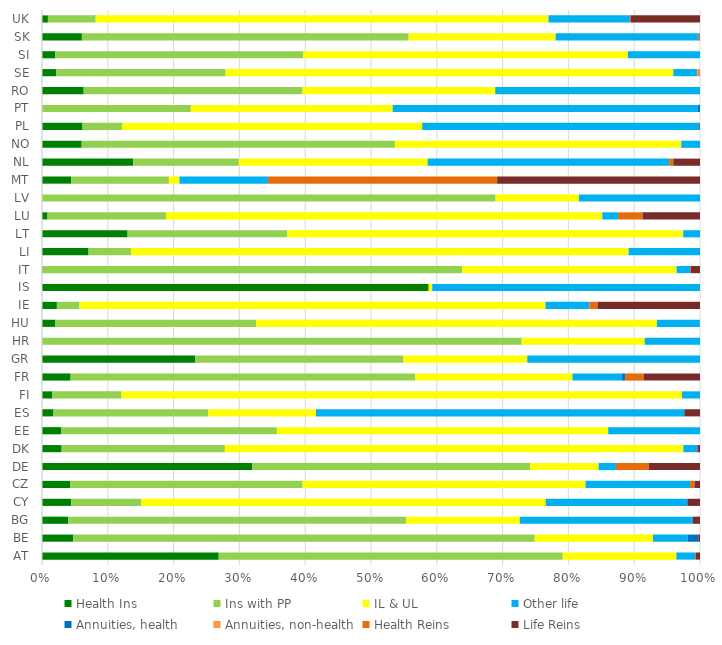
| Category | Health Ins | Ins with PP | IL & UL | Other life | Annuities, health | Annuities, non-health | Health Reins | Life Reins |
|---|---|---|---|---|---|---|---|---|
| AT | 2128.78 | 4143.22 | 1368.86 | 224.72 | 0 | 0 | 10.16 | 49.5 |
| BE | 712.99 | 10519.26 | 2694.96 | 790.87 | 242.16 | 0 | 0 | 38.92 |
| BG | 6.69 | 86 | 28.84 | 44.01 | 0 | 0 | 0 | 1.85 |
| CY | 15.49 | 37.23 | 214.92 | 75.22 | 0 | 0 | 0 | 6.74 |
| CZ | 86.45 | 708.93 | 863.95 | 319.25 | 0 | 0 | 13.66 | 16.59 |
| DE | 45901.28 | 60680.9 | 14973.67 | 3771.3 | -0.25 | 0 | 7200 | 11170.45 |
| DK | 708 | 5885.74 | 16529.8 | 470.09 | 42.69 | 0 | 3.2 | 84.96 |
| EE | 5.85 | 66.46 | 102 | 28.24 | 0 | 0 | 0 | 0 |
| ES | 546.66 | 7418.94 | 5153.27 | 17636.27 | 0 | 0 | 0 | 750.92 |
| FI | 71.4 | 476 | 3861.6 | 122.51 | 0 | 0 | 0 | 1.21 |
| FR | 7390.27 | 89070.1 | 40579.36 | 12836.24 | 744.42 | 27.43 | 4843.16 | 14503.09 |
| GR | 429.3 | 584.27 | 347.49 | 484.28 | 0 | 0 | 0 | 0.1 |
| HR | 0.24 | 288.8 | 74.14 | 33.29 | 0 | 0 | 0 | 0 |
| HU | 29.15 | 451.21 | 898.31 | 96.3 | 0 | 0 | 0.33 | 0 |
| IE | 1088.44 | 1653.97 | 34072.13 | 3211.79 | 0 | 0 | 609.81 | 7476.54 |
| IS | 27.35 | 0 | 0.25 | 18.94 | 0 | 0 | 0 | 0 |
| IT | 102.05 | 63932.1 | 32688.81 | 2062.26 | 0 | 0.97 | 130.83 | 1369.94 |
| LI | 154.94 | 141.3 | 1657.29 | 237.79 | 0 | 0 | 0 | 0 |
| LT | 20.42 | 38.09 | 94.44 | 4.01 | 0 | 0 | 0 | 0 |
| LU | 223.4 | 4766.47 | 17547.66 | 634.4 | 0 | 0 | 985.46 | 2307.51 |
| LV | 0 | 29.33 | 5.39 | 7.83 | 0 | 0 | 0 | 0 |
| MT | 97.37 | 324.69 | 35.11 | 294.45 | 0 | 0 | 762.63 | 674.76 |
| NL | 2199.55 | 2546.84 | 4553.03 | 5825.65 | 0 | 0 | 99.05 | 643.56 |
| NO | 582.71 | 4599.72 | 4204.25 | 274.97 | 0 | 0 | 0 | 0 |
| PL | 354.15 | 345.58 | 2622.78 | 2422.38 | 0 | 0 | 0.48 | 4.95 |
| PT | 2.89 | 1521.1 | 2065.88 | 3122.98 | 22.4 | 0 | 0 | 0.38 |
| RO | 25.53 | 133.98 | 118.01 | 125.35 | 0 | 0 | 0 | 0.01 |
| SE | 338.65 | 4014.29 | 10607.71 | 560.61 | 0 | 64.53 | 4.01 | 4.63 |
| SI | 9.86 | 183.13 | 239.91 | 53.23 | 0 | 0 | 0 | 0 |
| SK | 65.04 | 532.97 | 239.5 | 231.52 | 1.89 | 0.5 | 1.53 | 0 |
| UK | 2103.2 | 16942.27 | 160639.54 | 28852.91 | 0 | 0 | 363.54 | 24499.97 |